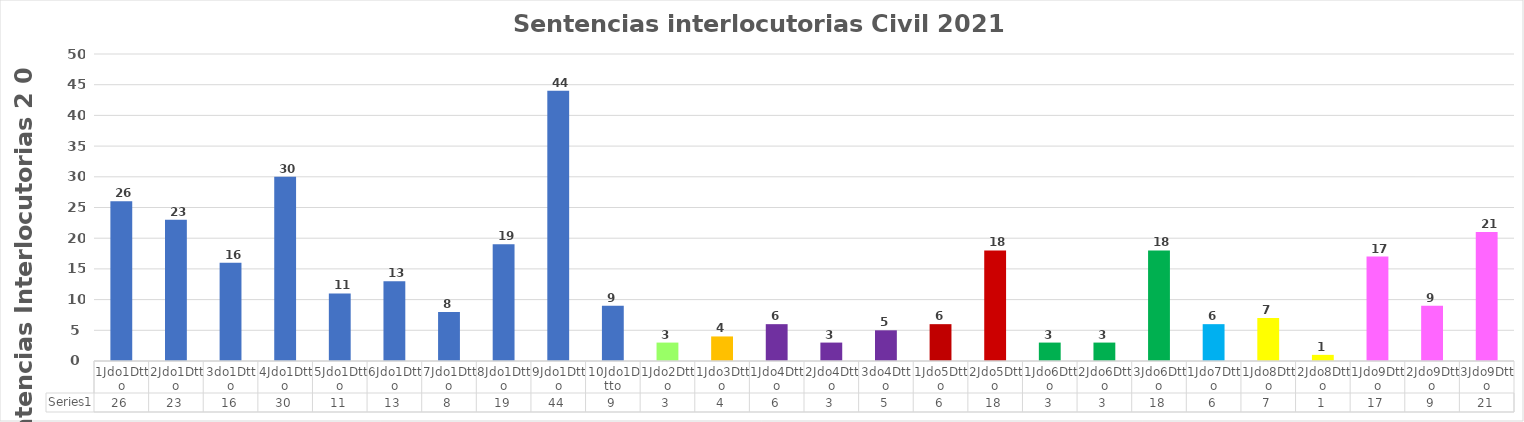
| Category | Series 0 |
|---|---|
| 1Jdo1Dtto | 26 |
| 2Jdo1Dtto | 23 |
| 3do1Dtto | 16 |
| 4Jdo1Dtto | 30 |
| 5Jdo1Dtto | 11 |
| 6Jdo1Dtto | 13 |
| 7Jdo1Dtto | 8 |
| 8Jdo1Dtto | 19 |
| 9Jdo1Dtto | 44 |
| 10Jdo1Dtto | 9 |
| 1Jdo2Dtto | 3 |
| 1Jdo3Dtto | 4 |
| 1Jdo4Dtto | 6 |
| 2Jdo4Dtto | 3 |
| 3do4Dtto | 5 |
| 1Jdo5Dtto | 6 |
| 2Jdo5Dtto | 18 |
| 1Jdo6Dtto | 3 |
| 2Jdo6Dtto | 3 |
| 3Jdo6Dtto | 18 |
| 1Jdo7Dtto | 6 |
| 1Jdo8Dtto | 7 |
| 2Jdo8Dtto | 1 |
| 1Jdo9Dtto | 17 |
| 2Jdo9Dtto | 9 |
| 3Jdo9Dtto | 21 |